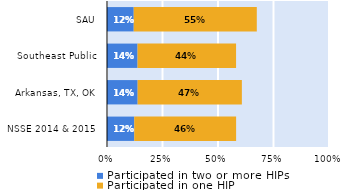
| Category | Participated in two or more HIPs | Participated in one HIP |
|---|---|---|
| NSSE 2014 & 2015 | 0.123 | 0.459 |
| Arkansas, TX, OK | 0.138 | 0.469 |
| Southeast Public | 0.138 | 0.444 |
| SAU | 0.12 | 0.554 |